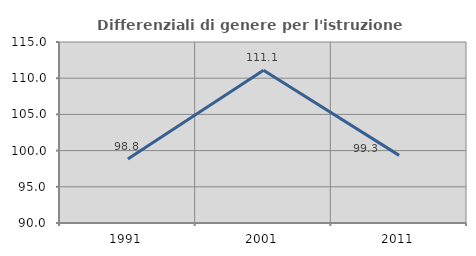
| Category | Differenziali di genere per l'istruzione superiore |
|---|---|
| 1991.0 | 98.831 |
| 2001.0 | 111.089 |
| 2011.0 | 99.338 |